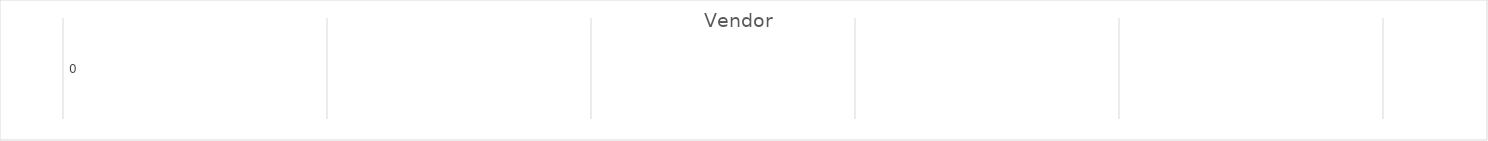
| Category | Vendor  |
|---|---|
| 0 | 0 |